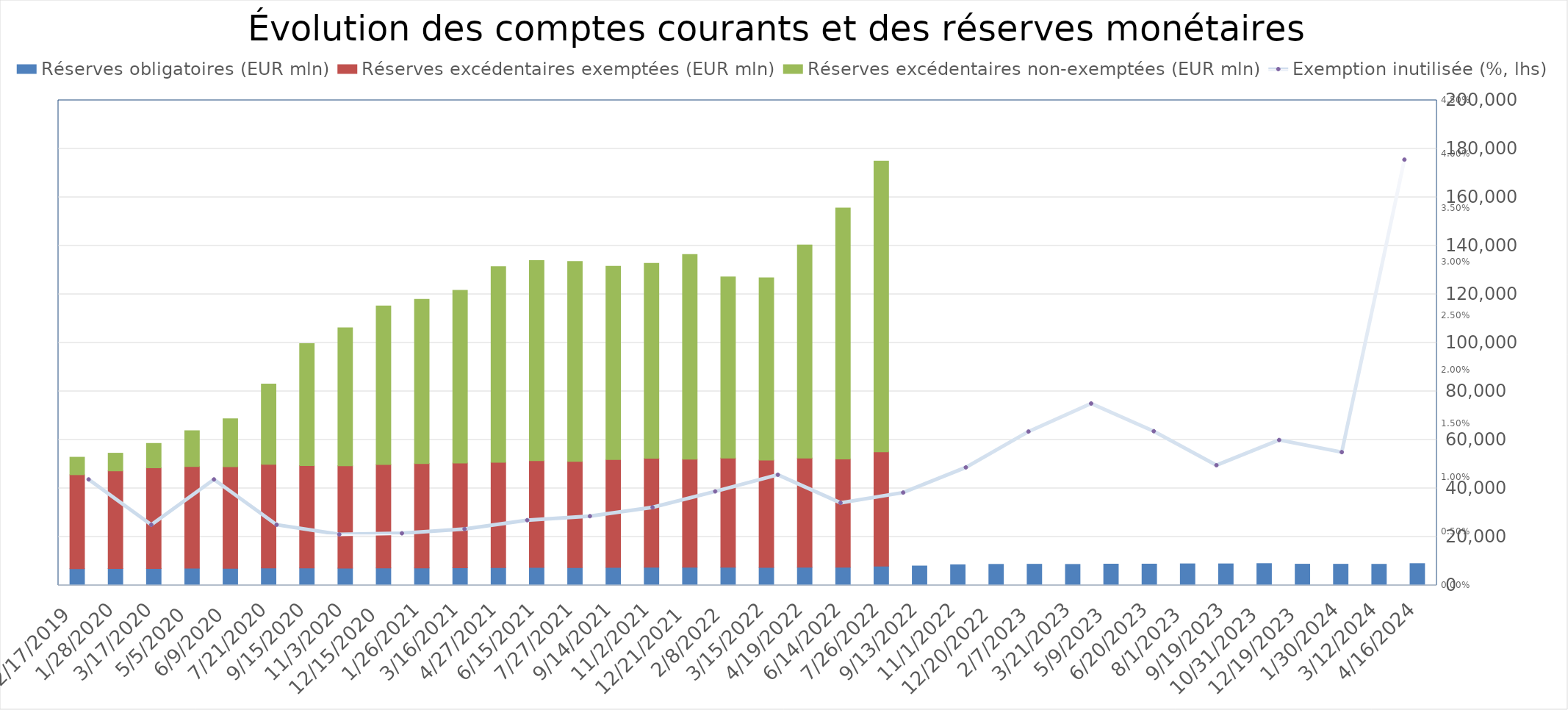
| Category | Réserves obligatoires (EUR mln) | Réserves excédentaires exemptées (EUR mln) | Réserves excédentaires non-exemptées (EUR mln) |
|---|---|---|---|
| 4/16/24 | 8997 | 0 | 0 |
| 3/12/24 | 8722 | 0 | 0 |
| 1/30/24 | 8741.019 | 0 | 0 |
| 12/19/23 | 8762 | 0 | 0 |
| 10/31/23 | 9001 | 0 | 0 |
| 9/19/23 | 8896 | 0 | 0 |
| 8/1/23 | 8904 | 0 | 0 |
| 6/20/23 | 8799 | 0 | 0 |
| 5/9/23 | 8796 | 0 | 0 |
| 3/21/23 | 8668 | 0 | 0 |
| 2/7/23 | 8736 | 0 | 0 |
| 12/20/22 | 8689 | 0 | 0 |
| 11/1/22 | 8517 | 0 | 0 |
| 9/13/22 | 8018 | 0 | 0 |
| 7/26/22 | 7929 | 47109 | 119909 |
| 6/14/22 | 7495 | 44621 | 103454 |
| 4/19/22 | 7536 | 44962 | 87885 |
| 3/15/22 | 7409 | 44244 | 75192 |
| 2/8/22 | 7536 | 44997 | 74696 |
| 12/21/21 | 7472 | 44599 | 84381 |
| 11/2/21 | 7531 | 44914 | 80355 |
| 9/14/21 | 7460 | 44471 | 79647 |
| 7/27/21 | 7352 | 43793 | 82435 |
| 6/15/21 | 7404 | 44036 | 82520 |
| 4/27/21 | 7313 | 43430 | 80697 |
| 3/16/21 | 7254 | 43192 | 71224 |
| 1/26/21 | 7225 | 42978 | 67723 |
| 12/15/20 | 7190 | 42671 | 65344 |
| 11/3/20 | 7128 | 42161 | 56951 |
| 9/15/20 | 7165 | 42265 | 50289 |
| 7/21/20 | 7217 | 42685 | 33099 |
| 6/9/20 | 7060 | 41891 | 19741 |
| 5/5/20 | 7085 | 41937 | 14783 |
| 3/17/20 | 7002 | 41491 | 10061 |
| 1/28/20 | 6981 | 40234 | 7303 |
| 12/17/19 | 6887 | 38752 | 7220 |